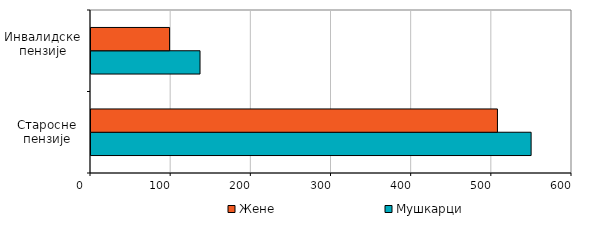
| Category | Мушкарци  | Жене  |
|---|---|---|
| Старосне
пензије | 549 | 507 |
| Инвалидске
пензије | 136 | 98 |